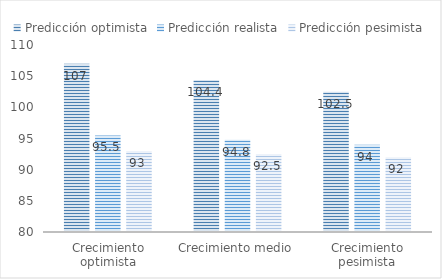
| Category | Predicción optimista | Predicción realista | Predicción pesimista |
|---|---|---|---|
| Crecimiento optimista | 107 | 95.5 | 93 |
| Crecimiento medio | 104.4 | 94.8 | 92.5 |
| Crecimiento pesimista | 102.5 | 94 | 92 |